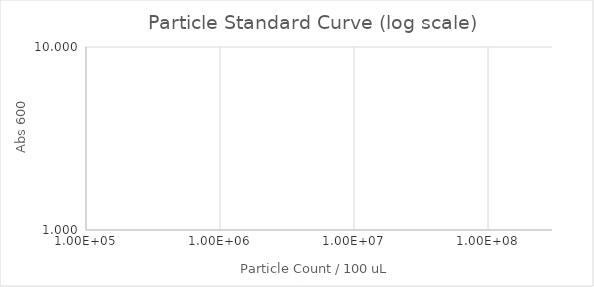
| Category | Series 1 |
|---|---|
| 235294117.64705887 | 0 |
| 117647058.82352944 | 0 |
| 58823529.41176472 | 0 |
| 29411764.70588236 | 0 |
| 14705882.35294118 | 0 |
| 7352941.17647059 | 0 |
| 3676470.588235295 | 0 |
| 1838235.2941176475 | 0 |
| 919117.6470588237 | 0 |
| 459558.82352941186 | 0 |
| 229779.41176470593 | 0 |